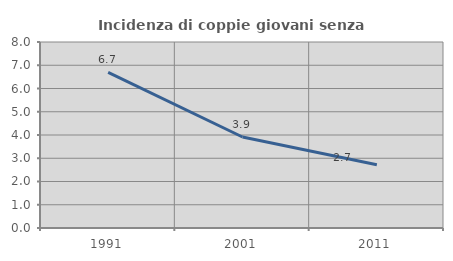
| Category | Incidenza di coppie giovani senza figli |
|---|---|
| 1991.0 | 6.69 |
| 2001.0 | 3.915 |
| 2011.0 | 2.721 |